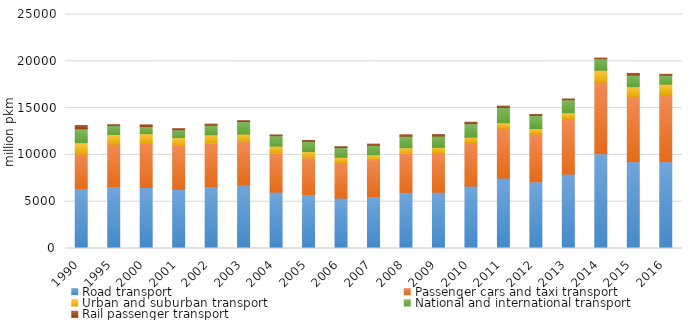
| Category | Road transport | Passenger cars and taxi transport | Urban and suburban transport | National and international transport | Rail passenger transport |
|---|---|---|---|---|---|
| 1990.0 | 6395 | 3692 | 1211 | 1492 | 355 |
| 1995.0 | 6581 | 4575 | 1035 | 971 | 65 |
| 2000.0 | 6519 | 4793 | 952 | 774 | 176 |
| 2001.0 | 6337 | 4671 | 835 | 831 | 133 |
| 2002.0 | 6591 | 4687 | 862 | 1042 | 98 |
| 2003.0 | 6784 | 4637 | 803 | 1344 | 92 |
| 2004.0 | 6022 | 4200 | 712 | 1110 | 94 |
| 2005.0 | 5722 | 3974 | 661 | 1087 | 94 |
| 2006.0 | 5387 | 3806 | 565 | 1016 | 105 |
| 2007.0 | 5518 | 3974 | 517 | 1027 | 109 |
| 2008.0 | 6000 | 4215 | 546 | 1239 | 148 |
| 2009.0 | 6009 | 4244 | 552 | 1213 | 154 |
| 2010.0 | 6667 | 4683 | 543 | 1441 | 155 |
| 2011.0 | 7530 | 5322 | 568 | 1640 | 145 |
| 2012.0 | 7110 | 5116 | 591 | 1403 | 99 |
| 2013.0 | 7944 | 5964 | 585 | 1395 | 80 |
| 2014.0 | 10128 | 7654 | 1266 | 1208 | 80 |
| 2015.0 | 9263 | 6987 | 1028 | 1248 | 178 |
| 2016.0 | 9261 | 7192 | 1101 | 968 | 83 |